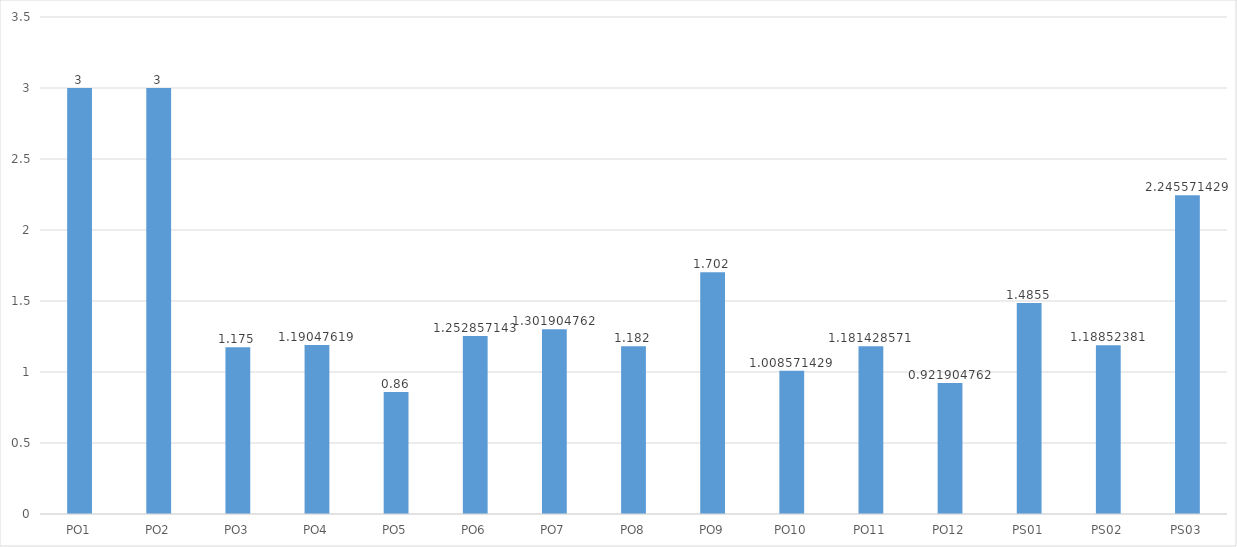
| Category | Series 0 |
|---|---|
| PO1 | 3 |
| PO2 | 3 |
| PO3 | 1.175 |
| PO4 | 1.19 |
| PO5 | 0.86 |
| PO6 | 1.253 |
| PO7 | 1.302 |
| PO8 | 1.182 |
| PO9 | 1.702 |
| PO10 | 1.009 |
| PO11 | 1.181 |
| PO12 | 0.922 |
| PS01 | 1.486 |
| PS02 | 1.189 |
| PS03 | 2.246 |